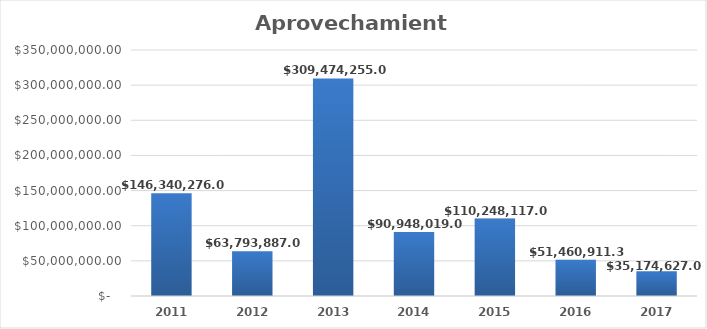
| Category | Aprovechamientos |
|---|---|
| 2011.0 | 146340276 |
| 2012.0 | 63793887 |
| 2013.0 | 309474255 |
| 2014.0 | 90948019 |
| 2015.0 | 110248117 |
| 2016.0 | 51460911.31 |
| 2017.0 | 35174627 |